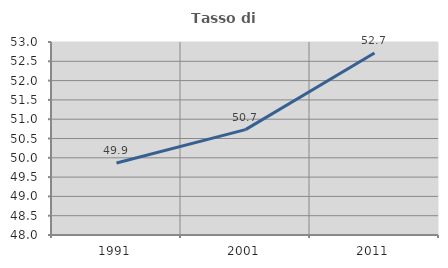
| Category | Tasso di occupazione   |
|---|---|
| 1991.0 | 49.867 |
| 2001.0 | 50.73 |
| 2011.0 | 52.715 |